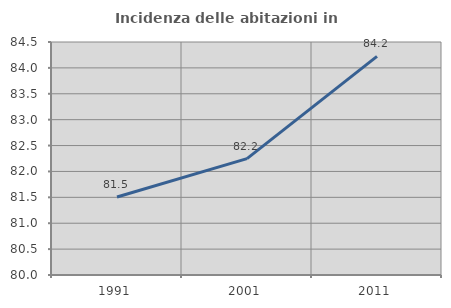
| Category | Incidenza delle abitazioni in proprietà  |
|---|---|
| 1991.0 | 81.507 |
| 2001.0 | 82.247 |
| 2011.0 | 84.223 |